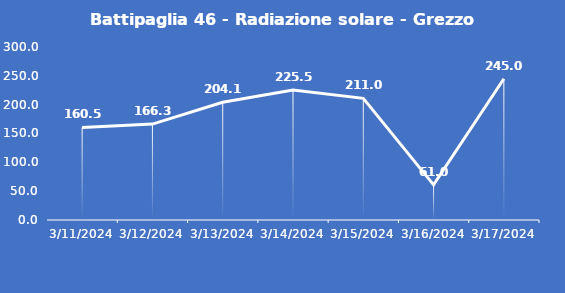
| Category | Battipaglia 46 - Radiazione solare - Grezzo (W/m2) |
|---|---|
| 3/11/24 | 160.5 |
| 3/12/24 | 166.3 |
| 3/13/24 | 204.1 |
| 3/14/24 | 225.5 |
| 3/15/24 | 211 |
| 3/16/24 | 61 |
| 3/17/24 | 245 |